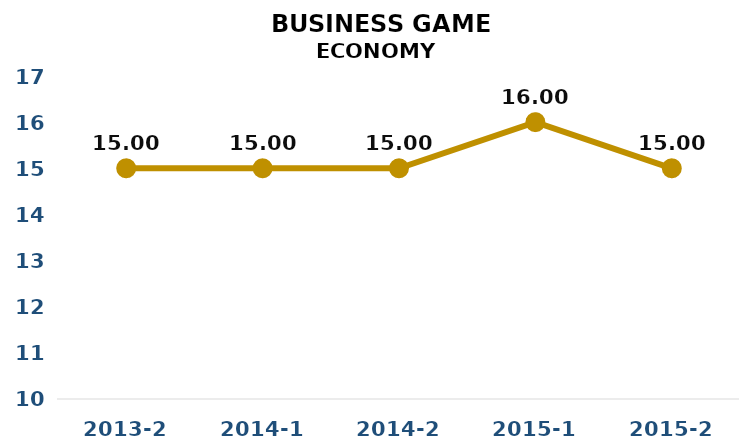
| Category | Series 0 |
|---|---|
| 2013-2 | 15 |
| 2014-1 | 15 |
| 2014-2 | 15 |
| 2015-1 | 16 |
| 2015-2 | 15 |